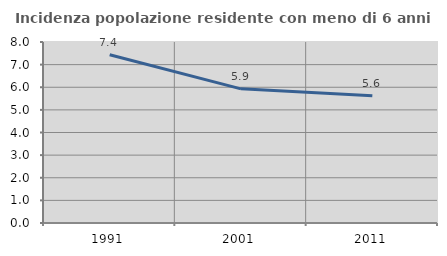
| Category | Incidenza popolazione residente con meno di 6 anni |
|---|---|
| 1991.0 | 7.438 |
| 2001.0 | 5.93 |
| 2011.0 | 5.623 |